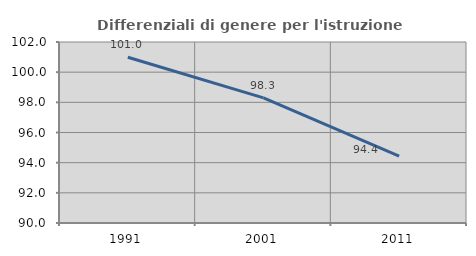
| Category | Differenziali di genere per l'istruzione superiore |
|---|---|
| 1991.0 | 100.985 |
| 2001.0 | 98.298 |
| 2011.0 | 94.428 |